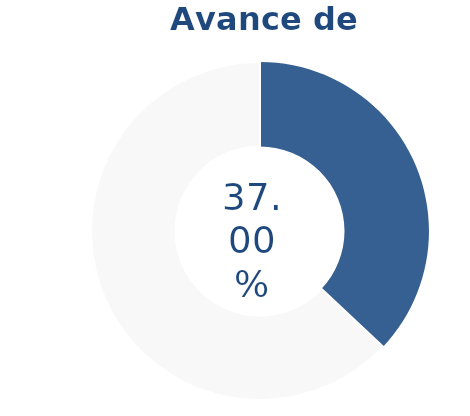
| Category | Series 0 |
|---|---|
| Acumulado 1 Trimestre | 0.37 |
| Año | -0.63 |